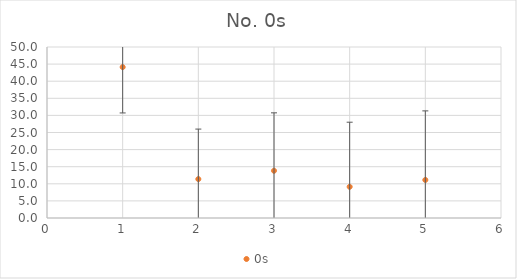
| Category | 0s |
|---|---|
| 0 | 44.125 |
| 1 | 11.375 |
| 2 | 13.812 |
| 3 | 9.125 |
| 4 | 11.125 |